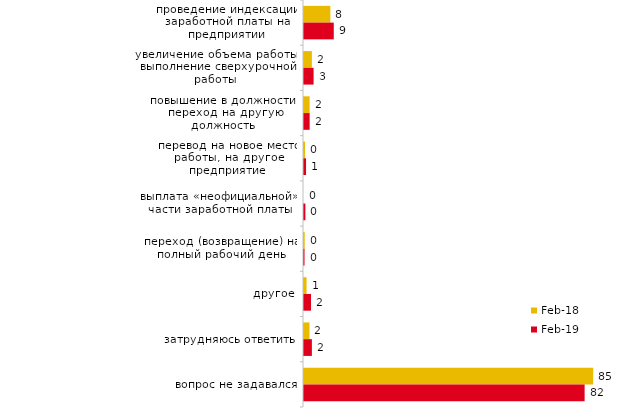
| Category | фев.18 | фев.19 |
|---|---|---|
| проведение индексации заработной платы на предприятии | 7.7 | 8.7 |
| увеличение объема работы, выполнение сверхурочной работы | 2.3 | 2.8 |
| повышение в должности, переход на другую должность | 1.65 | 1.65 |
| перевод на новое место работы, на другое предприятие | 0.3 | 0.6 |
| выплата «неофициальной» части заработной платы | 0 | 0.4 |
| переход (возвращение) на полный рабочий день | 0.2 | 0.15 |
| другое | 0.75 | 2.05 |
| затрудняюсь ответить | 1.6 | 2.3 |
| вопрос не задавался | 84.5 | 82 |